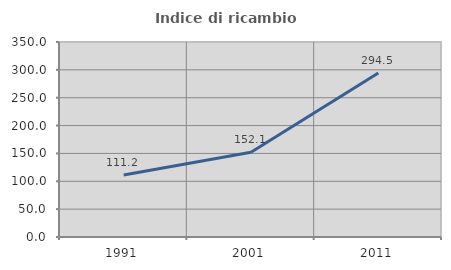
| Category | Indice di ricambio occupazionale  |
|---|---|
| 1991.0 | 111.153 |
| 2001.0 | 152.061 |
| 2011.0 | 294.495 |